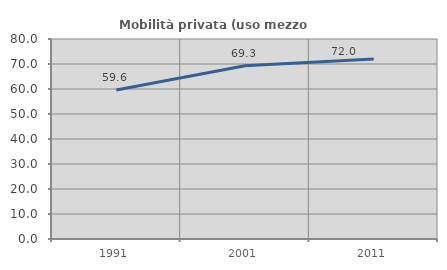
| Category | Mobilità privata (uso mezzo privato) |
|---|---|
| 1991.0 | 59.636 |
| 2001.0 | 69.263 |
| 2011.0 | 72.011 |